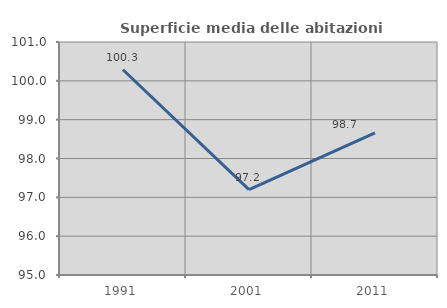
| Category | Superficie media delle abitazioni occupate |
|---|---|
| 1991.0 | 100.286 |
| 2001.0 | 97.199 |
| 2011.0 | 98.662 |